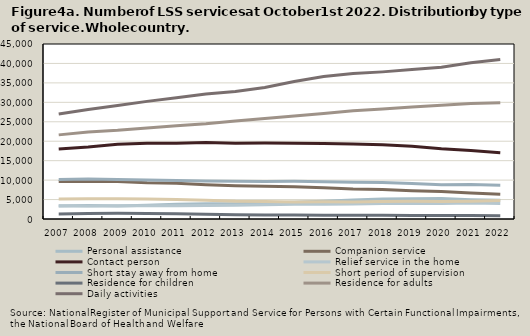
| Category | Personal assistance | Companion service | Contact person | Relief service in the home | Short stay away from home | Short period of supervision | Residence for children | Residence for adults | Daily activities |
|---|---|---|---|---|---|---|---|---|---|
| 2007.0 | 3331 | 9665 | 18014 | 3377 | 10142 | 5112 | 1294 | 21632 | 27016 |
| 2008.0 | 3478 | 9673 | 18508 | 3359 | 10288 | 5189 | 1402 | 22390 | 28160 |
| 2009.0 | 3370 | 9653 | 19246 | 3407 | 10187 | 5220 | 1447 | 22818 | 29198 |
| 2010.0 | 3562 | 9290 | 19497 | 3391 | 10010 | 5166 | 1442 | 23428 | 30248 |
| 2011.0 | 3781 | 9176 | 19453 | 3402 | 9924 | 5016 | 1328 | 23948 | 31175 |
| 2012.0 | 3900 | 8796 | 19668 | 3445 | 9774 | 4799 | 1230 | 24464 | 32149 |
| 2013.0 | 3914 | 8548 | 19481 | 3536 | 9685 | 4559 | 1096 | 25216 | 32809 |
| 2014.0 | 4099 | 8427 | 19520 | 3647 | 9639 | 4502 | 1032 | 25846 | 33799 |
| 2015.0 | 4287 | 8302 | 19496 | 3764 | 9700 | 4383 | 1049 | 26495 | 35344 |
| 2016.0 | 4567 | 8045 | 19423 | 3797 | 9606 | 4427 | 987 | 27113 | 36615 |
| 2017.0 | 4915 | 7710 | 19308 | 3875 | 9449 | 4389 | 969 | 27847 | 37400 |
| 2018.0 | 5143 | 7569 | 19107 | 3989 | 9354 | 4495 | 942 | 28289 | 37832 |
| 2019.0 | 5218 | 7293 | 18722 | 3990 | 9132 | 4558 | 926 | 28827 | 38425 |
| 2020.0 | 5274 | 7055 | 18053 | 4013 | 8791 | 4502 | 879 | 29237 | 39024 |
| 2021.0 | 4982 | 6670 | 17624 | 4113 | 8842 | 4576 | 874 | 29671 | 40202 |
| 2022.0 | 4795 | 6394 | 17057 | 4002 | 8685 | 4772 | 849 | 29897 | 40988 |